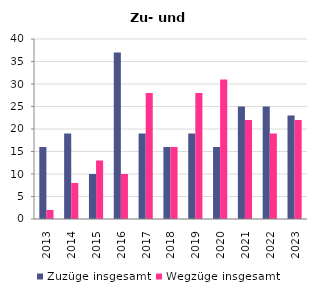
| Category | Zuzüge insgesamt | Wegzüge insgesamt |
|---|---|---|
| 2013.0 | 16 | 2 |
| 2014.0 | 19 | 8 |
| 2015.0 | 10 | 13 |
| 2016.0 | 37 | 10 |
| 2017.0 | 19 | 28 |
| 2018.0 | 16 | 16 |
| 2019.0 | 19 | 28 |
| 2020.0 | 16 | 31 |
| 2021.0 | 25 | 22 |
| 2022.0 | 25 | 19 |
| 2023.0 | 23 | 22 |